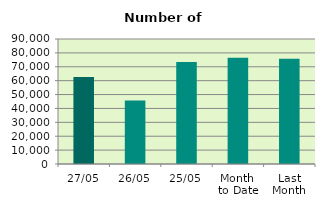
| Category | Series 0 |
|---|---|
| 27/05 | 62630 |
| 26/05 | 45674 |
| 25/05 | 73494 |
| Month 
to Date | 76544.842 |
| Last
Month | 75814.526 |